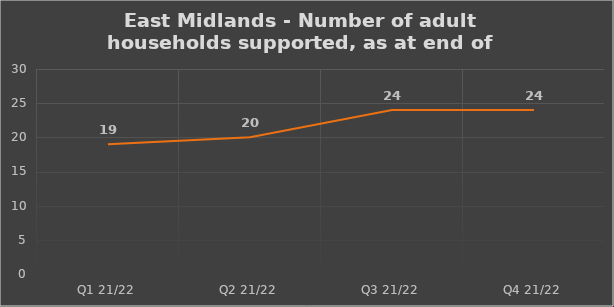
| Category | Number of financially supported households at end of quarter |
|---|---|
| Q1 21/22 | 19 |
| Q2 21/22 | 20 |
| Q3 21/22 | 24 |
| Q4 21/22 | 24 |